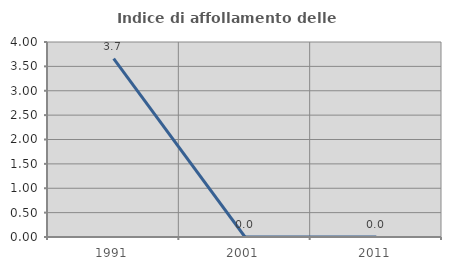
| Category | Indice di affollamento delle abitazioni  |
|---|---|
| 1991.0 | 3.659 |
| 2001.0 | 0 |
| 2011.0 | 0 |